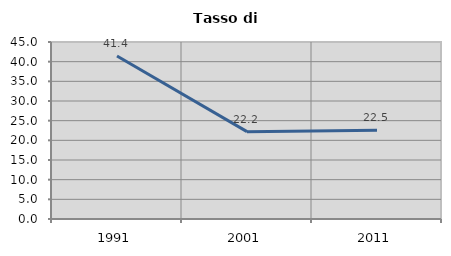
| Category | Tasso di disoccupazione   |
|---|---|
| 1991.0 | 41.449 |
| 2001.0 | 22.213 |
| 2011.0 | 22.536 |